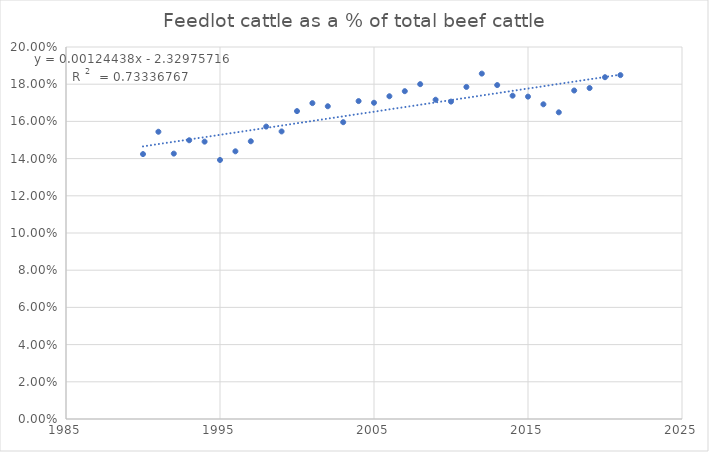
| Category | Series 0 |
|---|---|
| 1990.0 | 0.142 |
| 1991.0 | 0.154 |
| 1992.0 | 0.143 |
| 1993.0 | 0.15 |
| 1994.0 | 0.149 |
| 1995.0 | 0.139 |
| 1996.0 | 0.144 |
| 1997.0 | 0.149 |
| 1998.0 | 0.157 |
| 1999.0 | 0.155 |
| 2000.0 | 0.166 |
| 2001.0 | 0.17 |
| 2002.0 | 0.168 |
| 2003.0 | 0.16 |
| 2004.0 | 0.171 |
| 2005.0 | 0.17 |
| 2006.0 | 0.174 |
| 2007.0 | 0.176 |
| 2008.0 | 0.18 |
| 2009.0 | 0.172 |
| 2010.0 | 0.171 |
| 2011.0 | 0.179 |
| 2012.0 | 0.186 |
| 2013.0 | 0.18 |
| 2014.0 | 0.174 |
| 2015.0 | 0.173 |
| 2016.0 | 0.169 |
| 2017.0 | 0.165 |
| 2018.0 | 0.177 |
| 2019.0 | 0.178 |
| 2020.0 | 0.184 |
| 2021.0 | 0.185 |